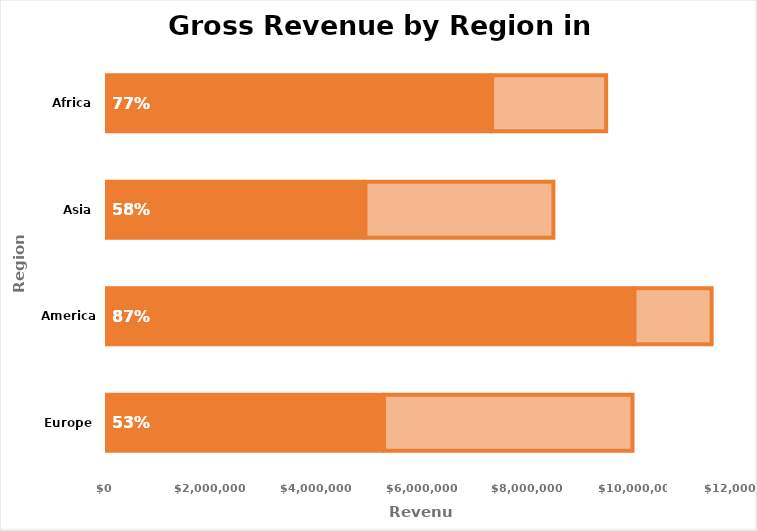
| Category | Revenue | Remainder |
|---|---|---|
| Europe | 5250000 | 4750000 |
| Americas | 10000000 | 1500000 |
| Asia | 4900000 | 3600000 |
| Africa | 7300000 | 2200000 |